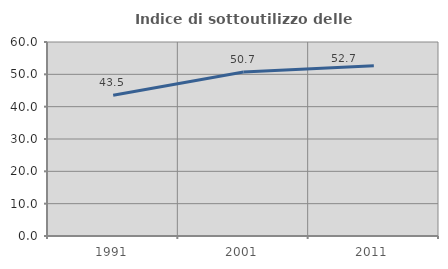
| Category | Indice di sottoutilizzo delle abitazioni  |
|---|---|
| 1991.0 | 43.502 |
| 2001.0 | 50.738 |
| 2011.0 | 52.652 |